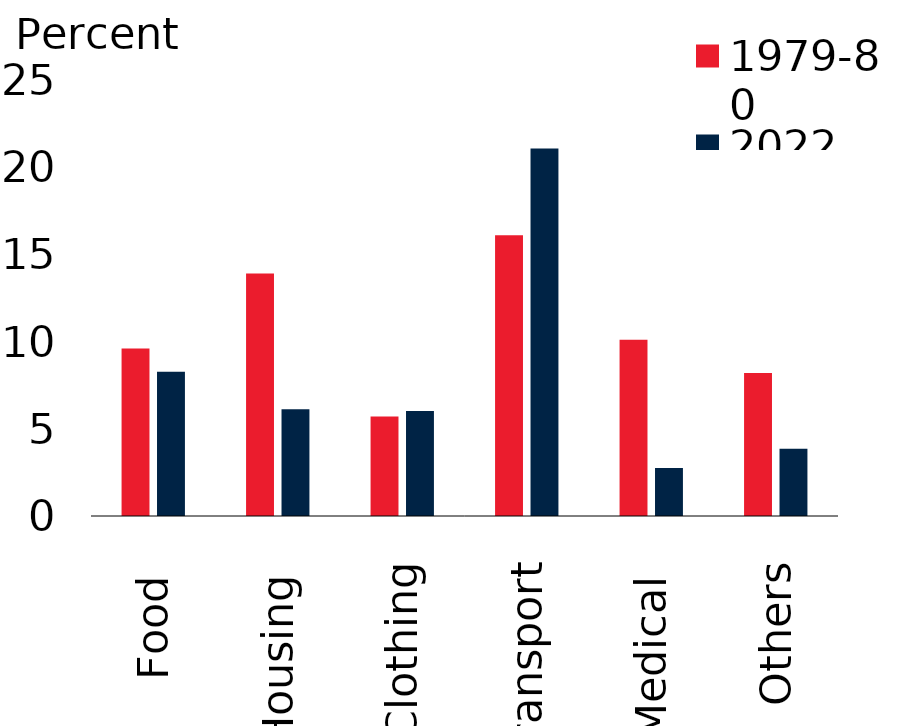
| Category | 1979-80 | 2022 |
|---|---|---|
| Food  | 9.6 |  |
| Housing  | 13.9 |  |
| Clothing | 5.7 |  |
| Transport | 16.1 |  |
| Medical  | 10.1 |  |
| Others | 8.2 |  |